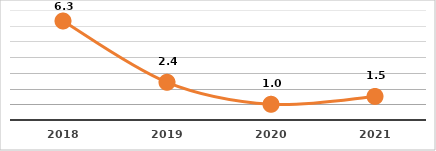
| Category | COBERTURA DE BECADOS EXTERNOS (%)
TERCER TRIMESTRE, EJERCICIO 2021 |
|---|---|
| 2018.0 | 6.3 |
| 2019.0 | 2.4 |
| 2020.0 | 1 |
| 2021.0 | 1.5 |